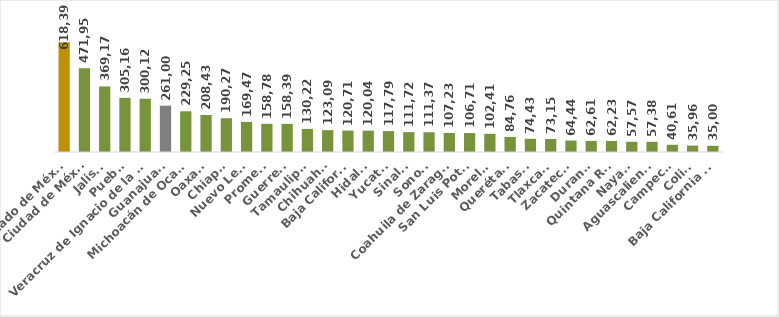
| Category | Series 0 |
|---|---|
| Estado de México | 618392 |
| Ciudad de México | 471957 |
| Jalisco | 369177 |
| Puebla | 305169 |
| Veracruz de Ignacio de la Llave | 300129 |
| Guanajuato | 261005 |
| Michoacán de Ocampo | 229253 |
| Oaxaca | 208439 |
| Chiapas | 190273 |
| Nuevo León | 169476 |
| Promedio | 158787.25 |
| Guerrero | 158391 |
| Tamaulipas | 130220 |
| Chihuahua | 123093 |
| Baja California | 120714 |
| Hidalgo | 120049 |
| Yucatán | 117793 |
| Sinaloa | 111729 |
| Sonora | 111376 |
| Coahuila de Zaragoza | 107232 |
| San Luis Potosí | 106712 |
| Morelos | 102415 |
| Querétaro | 84765 |
| Tabasco | 74435 |
| Tlaxcala | 73151 |
| Zacatecas | 64441 |
| Durango | 62613 |
| Quintana Roo | 62236 |
| Nayarit | 57577 |
| Aguascalientes | 57389 |
| Campeche | 40616 |
| Colima | 35969 |
| Baja California Sur | 35006 |